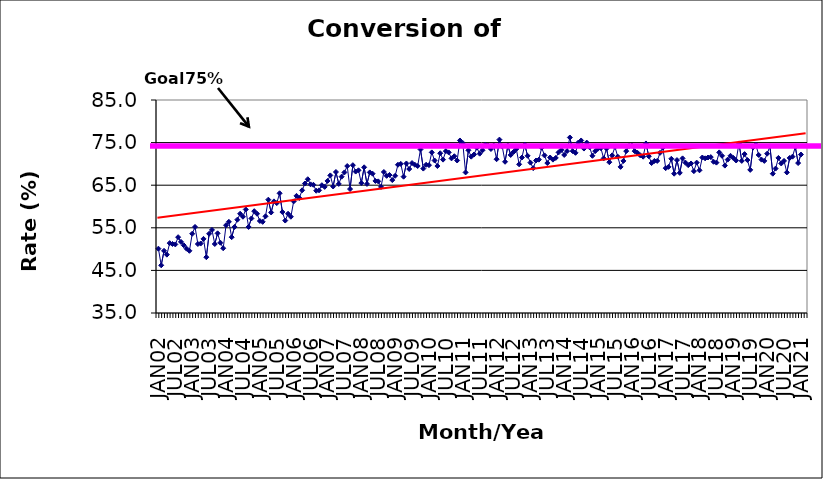
| Category | Series 0 |
|---|---|
| JAN02 | 50.1 |
| FEB02 | 46.2 |
| MAR02 | 49.6 |
| APR02 | 48.7 |
| MAY02 | 51.4 |
| JUN02 | 51.2 |
| JUL02 | 51.1 |
| AUG02 | 52.8 |
| SEP02 | 51.7 |
| OCT02 | 50.9 |
| NOV02 | 50.1 |
| DEC02 | 49.6 |
| JAN03 | 53.6 |
| FEB03 | 55.2 |
| MAR03 | 51.2 |
| APR03 | 51.3 |
| MAY03 | 52.4 |
| JUN03 | 48.1 |
| JUL03 | 53.6 |
| AUG03 | 54.5 |
| SEP03 | 51.2 |
| OCT03 | 53.7 |
| NOV03 | 51.5 |
| DEC03 | 50.2 |
| JAN04 | 55.6 |
| FEB04 | 56.4 |
| MAR04 | 52.8 |
| APR04 | 55.2 |
| MAY04 | 56.9 |
| JUN04 | 58.3 |
| JUL04 | 57.6 |
| AUG04 | 59.3 |
| SEP04 | 55.2 |
| OCT04 | 57.2 |
| NOV04 | 58.9 |
| DEC04 | 58.3 |
| JAN05 | 56.6 |
| FEB05 | 56.4 |
| MAR05 | 57.7 |
| APR05 | 61.6 |
| MAY05 | 58.6 |
| JUN05 | 61.2 |
| JUL05 | 60.8 |
| AUG05 | 63.1 |
| SEP05 | 58.7 |
| OCT05 | 56.7 |
| NOV05 | 58.3 |
| DEC05 | 57.6 |
| JAN06 | 61.2 |
| FEB06 | 62.5 |
| MAR06 | 62 |
| APR06 | 63.8 |
| MAY06 | 65.4 |
| JUN06 | 66.4 |
| JUL06 | 65.2 |
| AUG06 | 65.1 |
| SEP06 | 63.7 |
| OCT06 | 63.8 |
| NOV06 | 65 |
| DEC06 | 64.6 |
| JAN07 | 66 |
| FEB07 | 67.3 |
| MAR07 | 64.7 |
| APR07 | 68.1 |
| MAY07 | 65.3 |
| JUN07 | 67 |
| JUL07 | 68 |
| AUG07 | 69.5 |
| SEP07 | 64.1 |
| OCT07 | 69.7 |
| NOV07 | 68.2 |
| DEC07 | 68.5 |
| JAN08 | 65.5 |
| FEB08 | 69.2 |
| MAR08 | 65.3 |
| APR08 | 68 |
| MAY08 | 67.7 |
| JUN08 | 66 |
| JUL08 | 65.9 |
| AUG08 | 64.6 |
| SEP08 | 68.1 |
| OCT08 | 67.2 |
| NOV08 | 67.4 |
| DEC08 | 66.2 |
| JAN09 | 67.2 |
| FEB09 | 69.8 |
| MAR09 | 70 |
| APR09 | 67 |
| MAY09 | 70.1 |
| JUN09 | 68.8 |
| JUL09 | 70.2 |
| AUG09 | 69.8 |
| SEP09 | 69.5 |
| OCT09 | 73.4 |
| NOV09 | 68.9 |
| DEC09 | 69.8 |
| JAN10 | 69.7 |
| FEB10 | 72.7 |
| MAR10 | 70.8 |
| APR10 | 69.5 |
| MAY10 | 72.5 |
| JUN10 | 71 |
| JUL10 | 73 |
| AUG10 | 72.7 |
| SEP10 | 71.3 |
| OCT10 | 71.8 |
| NOV10 | 70.8 |
| DEC10 | 75.5 |
| JAN11 | 74.9 |
| FEB11 | 68 |
| MAR11 | 73.2 |
| APR11 | 71.7 |
| MAY11 | 72.2 |
| JUN11 | 73.8 |
| JUL11 | 72.4 |
| AUG11 | 73.2 |
| SEP11 | 74.5 |
| OCT11 | 74.3 |
| NOV11 | 73.5 |
| DEC11 | 74.3 |
| JAN12 | 71.1 |
| FEB12 | 75.7 |
| MAR12 | 74.1 |
| APR12 | 70.5 |
| MAY12 | 74.3 |
| JUN12 | 72.1 |
| JUL12 | 72.8 |
| AUG12 | 73.5 |
| SEP12 | 69.9 |
| OCT12 | 71.5 |
| NOV12 | 74.5 |
| DEC12 | 71.9 |
| JAN13 | 70.3 |
| FEB13 | 69 |
| MAR13 | 70.8 |
| APR13 | 71 |
| MAY13 | 73.8 |
| JUN13 | 72 |
| JUL13 | 70.2 |
| AUG13 | 71.5 |
| SEP13 | 71 |
| OCT13 | 71.4 |
| NOV13 | 72.7 |
| DEC13 | 73.3 |
| JAN14 | 72.1 |
| FEB14 | 73 |
| MAR14 | 76.2 |
| APR14 | 73 |
| MAY14 | 72.6 |
| JUN14 | 75 |
| JUL14 | 75.5 |
| AUG14 | 73.6 |
| SEP14 | 75 |
| OCT14 | 73.9 |
| NOV14 | 71.9 |
| DEC14 | 73 |
| JAN15 | 73.6 |
| FEB15 | 73.7 |
| MAR15 | 71.3 |
| APR15 | 73.6 |
| MAY15 | 70.4 |
| JUN15 | 72 |
| JUL15 | 74 |
| AUG15 | 71.7 |
| SEP15 | 69.3 |
| OCT15 | 70.7 |
| NOV15 | 73 |
| DEC15 | 74.2 |
| JAN16 | 74.3 |
| FEB16 | 73 |
| MAR16 | 72.6 |
| APR16 | 72 |
| MAY16 | 71.7 |
| JUN16 | 74.8 |
| JUL16 | 71.8 |
| AUG16 | 70.2 |
| SEP16 | 70.7 |
| OCT16 | 70.7 |
| NOV16 | 72.6 |
| DEC16 | 73.8 |
| JAN17 | 69 |
| FEB17 | 69.3 |
| MAR17 | 71.2 |
| APR17 | 67.7 |
| MAY17 | 70.9 |
| JUN17 | 67.9 |
| JUL17 | 71.3 |
| AUG17 | 70.3 |
| SEP17 | 69.7 |
| OCT17 | 70.1 |
| NOV17 | 68.3 |
| DEC17 | 70.3 |
| JAN18 | 68.5 |
| FEB18 | 71.5 |
| MAR18 | 71.3 |
| APR18 | 71.5 |
| MAY18 | 71.6 |
| JUN18 | 70.5 |
| JUL18 | 70.3 |
| AUG18 | 72.7 |
| SEP18 | 71.9 |
| OCT18 | 69.6 |
| NOV18 | 71 |
| DEC18 | 71.9 |
| JAN19 | 71.4 |
| FEB19 | 70.8 |
| MAR19 | 74.8 |
| APR19 | 70.7 |
| MAY19 | 72.3 |
| JUN19 | 70.9 |
| JUL19 | 68.6 |
| AUG19 | 73.9 |
| SEP19 | 74.5 |
| OCT19 | 72.1 |
| NOV19 | 71 |
| DEC19 | 70.7 |
| JAN20 | 72.4 |
| FEB20 | 74.1 |
| MAR20 | 67.7 |
| APR20 | 68.9 |
| MAY20 | 71.4 |
| JUN20 | 70.1 |
| JUL20 | 70.7 |
| AUG20 | 68 |
| SEP20 | 71.4 |
| OCT20 | 71.7 |
| NOV20 | 74 |
| DEC20 | 70.2 |
| JAN21 | 72.2 |